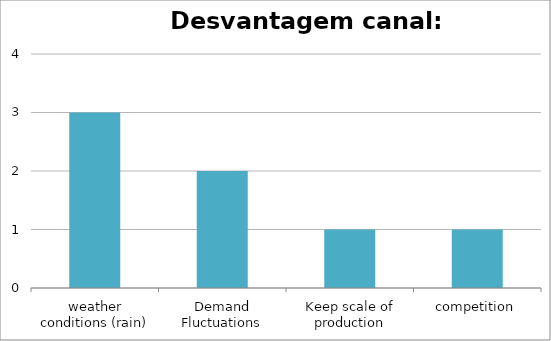
| Category | Series 0 |
|---|---|
| weather conditions (rain) | 3 |
| Demand Fluctuations | 2 |
| Keep scale of production | 1 |
| competition | 1 |